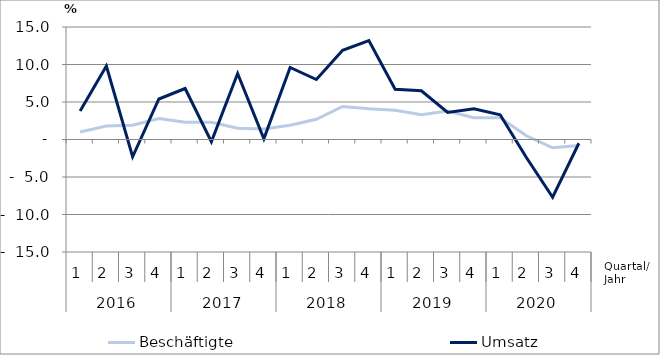
| Category | Beschäftigte | Umsatz |
|---|---|---|
| 0 | 1 | 3.8 |
| 1 | 1.8 | 9.8 |
| 2 | 1.9 | -2.3 |
| 3 | 2.8 | 5.4 |
| 4 | 2.3 | 6.8 |
| 5 | 2.3 | -0.3 |
| 6 | 1.5 | 8.8 |
| 7 | 1.4 | 0.1 |
| 8 | 1.9 | 9.6 |
| 9 | 2.7 | 8 |
| 10 | 4.4 | 11.9 |
| 11 | 4.1 | 13.2 |
| 12 | 3.9 | 6.7 |
| 13 | 3.3 | 6.5 |
| 14 | 3.8 | 3.6 |
| 15 | 2.9 | 4.1 |
| 16 | 2.9 | 3.3 |
| 17 | 0.5 | -2.4 |
| 18 | -1.1 | -7.7 |
| 19 | -0.8 | -0.5 |